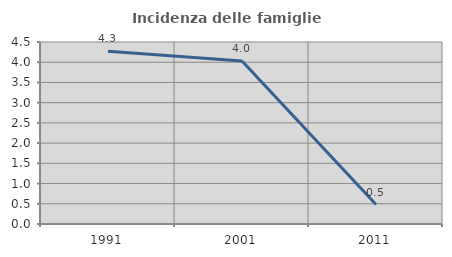
| Category | Incidenza delle famiglie numerose |
|---|---|
| 1991.0 | 4.27 |
| 2001.0 | 4.03 |
| 2011.0 | 0.481 |